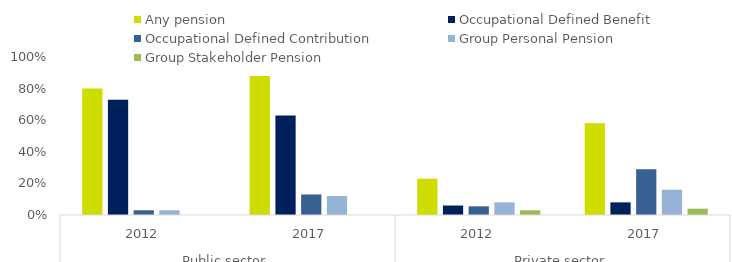
| Category | Any pension | Occupational Defined Benefit | Occupational Defined Contribution | Group Personal Pension | Group Stakeholder Pension |
|---|---|---|---|---|---|
| 0 | 0.8 | 0.73 | 0.03 | 0.03 | 0 |
| 1 | 0.88 | 0.63 | 0.13 | 0.12 | 0 |
| 2 | 0.23 | 0.06 | 0.055 | 0.08 | 0.03 |
| 3 | 0.58 | 0.08 | 0.29 | 0.16 | 0.04 |